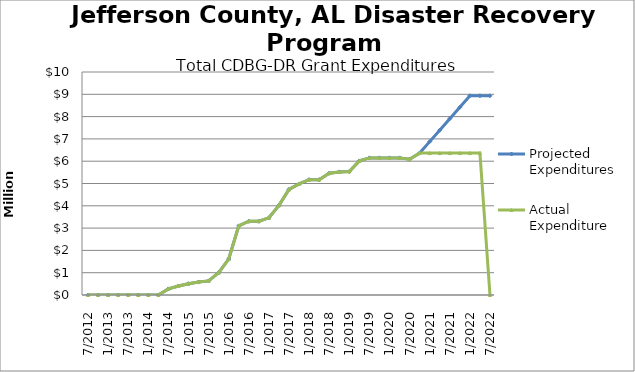
| Category | Projected Expenditures | Actual Expenditure |
|---|---|---|
| 7/2012 | 0 | 0 |
| 10/2012 | 0 | 0 |
| 1/2013 | 0 | 0 |
| 4/2013 | 0 | 0 |
| 7/2013 | 0 | 0 |
| 10/2013 | 0 | 0 |
| 1/2014 | 0 | 0 |
| 4/2014 | 0 | 0 |
| 7/2014 | 275002 | 275002.32 |
| 10/2014 | 404888 | 404888.84 |
| 1/2015 | 506681 | 506681.73 |
| 4/2015 | 580737 | 580737.94 |
| 7/2015 | 633110 | 633110.81 |
| 10/2015 | 998192 | 998192.31 |
| 1/2016 | 1612889 | 1612889.67 |
| 4/2016 | 3098503 | 3098504.26 |
| 7/2016 | 3307043 | 3307043.92 |
| 10/2016 | 3307043 | 3307043.92 |
| 1/2017 | 3461193 | 3461193.83 |
| 4/2017 | 4017739 | 4017739.35 |
| 7/2017 | 4733011 | 4733011.54 |
| 10/2017 | 4979400 | 4979400.6 |
| 1/2018 | 5173088 | 5173088.36 |
| 4/2018 | 5173088 | 5173088.36 |
| 7/2018 | 5462939.89 | 5462940.89 |
| 10/2018 | 5519452.64 | 5519453.62 |
| 1/2019 | 5536632.7 | 5536633.68 |
| 4/2019 | 6011954.47 | 6011955.4 |
| 7/2019 | 6149058.41 | 6149059.14 |
| 10/2019 | 6149058.41 | 6149059.14 |
| 1/2020 | 6149058.41 | 6149059.14 |
| 4/2020 | 6149058.41 | 6149059.14 |
| 7/2020 | 6090861.38 | 6090862.49 |
| 10/2020 | 6363555.38 | 6363556.07 |
| 1/2021 | 6877802.43 | 6363556.07 |
| 4/2021 | 7392049.48 | 6363556.07 |
| 7/2021 | 7906296.53 | 6363556.07 |
| 10/2021 | 8420543.58 | 6363556.07 |
| 1/2022 | 8934790.63 | 6363556.07 |
| 4/2022 | 8934790.63 | 6363556.07 |
| 7/2022 | 8934790.63 | 0 |